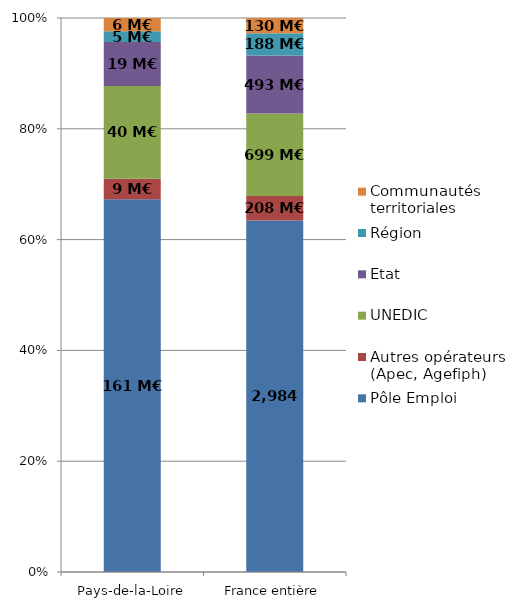
| Category | Pôle Emploi | Autres opérateurs (Apec, Agefiph) | UNEDIC | Etat | Région | Communautés territoriales |
|---|---|---|---|---|---|---|
| Pays-de-la-Loire | 160.527 | 8.819 | 39.911 | 19.042 | 4.546 | 5.743 |
| France entière | 2983.694 | 207.577 | 699.479 | 493.308 | 188.079 | 129.71 |